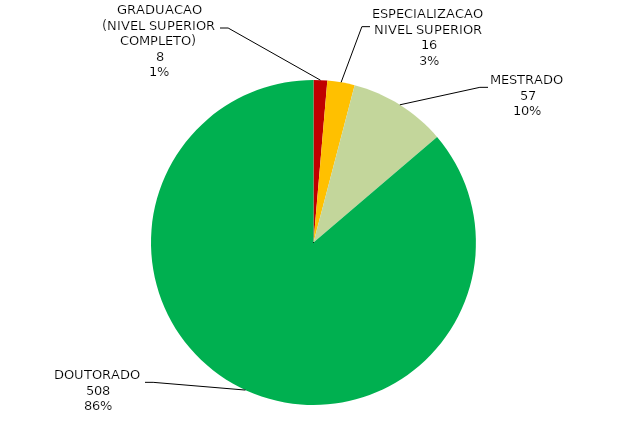
| Category | Total geral |
|---|---|
| GRADUACAO (NIVEL SUPERIOR COMPLETO) | 8 |
| ESPECIALIZACAO NIVEL SUPERIOR | 16 |
| MESTRADO | 57 |
| DOUTORADO | 508 |